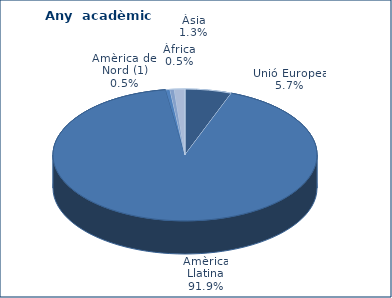
| Category | 2011-2012 |
|---|---|
| Unió Europea | 22 |
| Resta d'Europa | 0 |
| Amèrica Llatina | 354 |
| Amèrica del Nord (1) | 2 |
| Àfrica | 2 |
| Àsia | 5 |
| Oceania | 0 |